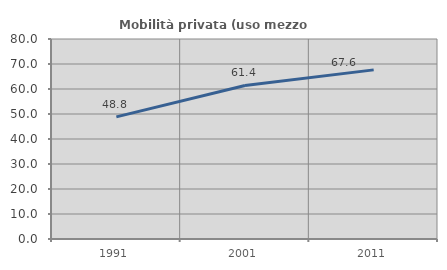
| Category | Mobilità privata (uso mezzo privato) |
|---|---|
| 1991.0 | 48.847 |
| 2001.0 | 61.422 |
| 2011.0 | 67.649 |